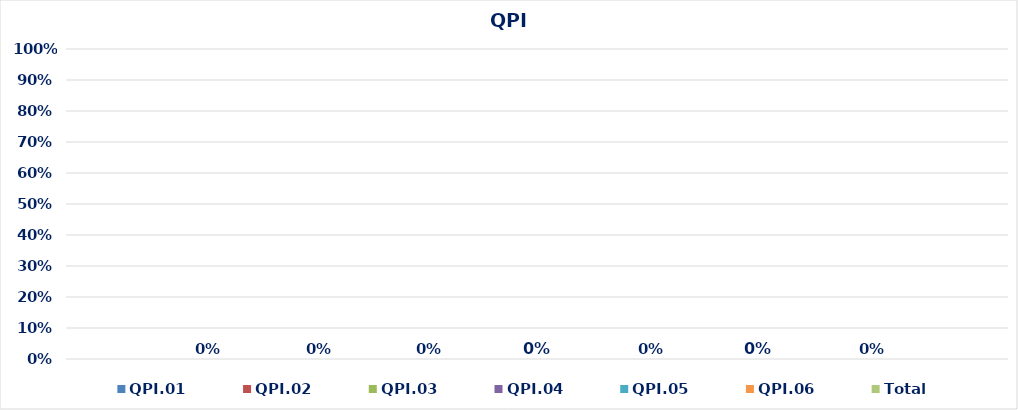
| Category | QPI.01 | QPI.02 | QPI.03 | QPI.04 | QPI.05 | QPI.06 | Total |
|---|---|---|---|---|---|---|---|
| 0 | 0 | 0 | 0 | 0 | 0 | 0 | 0 |